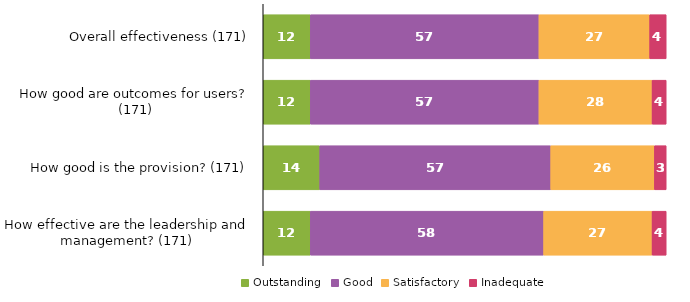
| Category | Outstanding | Good | Satisfactory | Inadequate |
|---|---|---|---|---|
| Overall effectiveness (171) | 11.696 | 56.725 | 27.485 | 4.094 |
| How good are outcomes for users? (171) | 11.696 | 56.725 | 28.07 | 3.509 |
| How good is the provision? (171) | 14.035 | 57.31 | 25.731 | 2.924 |
| How effective are the leadership and management? (171) | 11.696 | 57.895 | 26.901 | 3.509 |